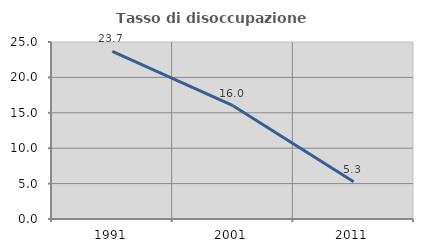
| Category | Tasso di disoccupazione giovanile  |
|---|---|
| 1991.0 | 23.684 |
| 2001.0 | 16 |
| 2011.0 | 5.263 |